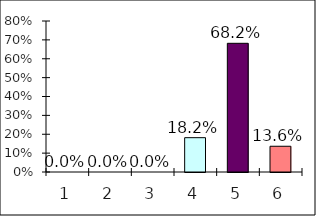
| Category | Series 0 |
|---|---|
| 0 | 0 |
| 1 | 0 |
| 2 | 0 |
| 3 | 0.182 |
| 4 | 0.682 |
| 5 | 0.136 |